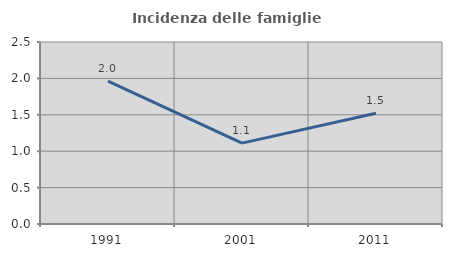
| Category | Incidenza delle famiglie numerose |
|---|---|
| 1991.0 | 1.962 |
| 2001.0 | 1.11 |
| 2011.0 | 1.521 |